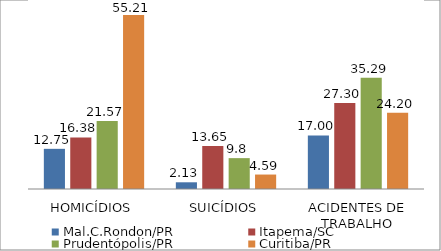
| Category | Mal.C.Rondon/PR | Itapema/SC | Prudentópolis/PR | Toledo/PR | Cascavel/PR | Curitiba/PR |
|---|---|---|---|---|---|---|
| HOMICÍDIOS | 12.75 | 16.38 | 21.57 |  |  | 55.21 |
| SUICÍDIOS | 2.13 | 13.65 | 9.8 |  |  | 4.59 |
| ACIDENTES DE TRABALHO | 17 | 27.3 | 35.29 |  |  | 24.2 |